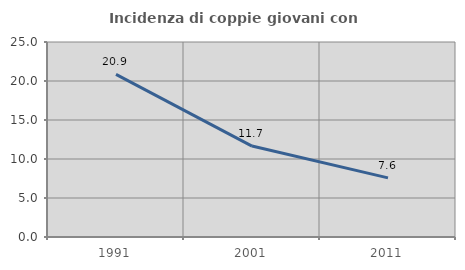
| Category | Incidenza di coppie giovani con figli |
|---|---|
| 1991.0 | 20.856 |
| 2001.0 | 11.656 |
| 2011.0 | 7.58 |